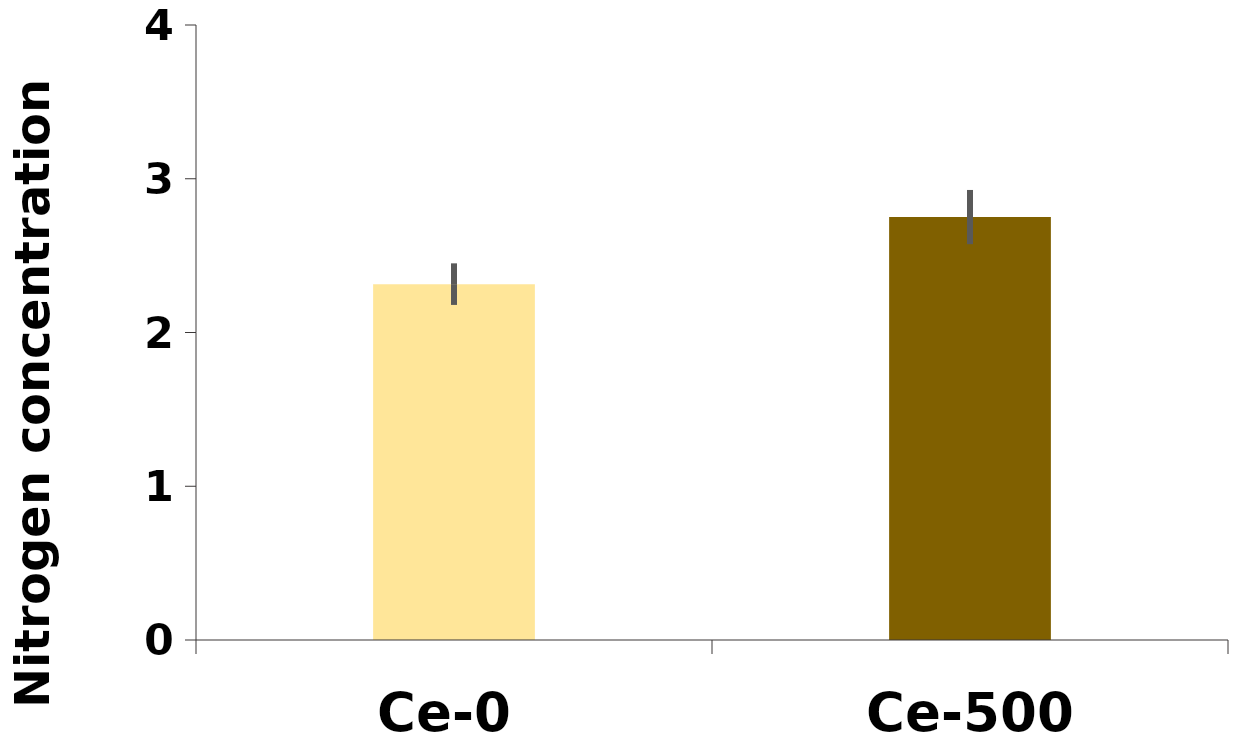
| Category | %N |
|---|---|
| Ce-0 | 2.315 |
| Ce-500 | 2.751 |